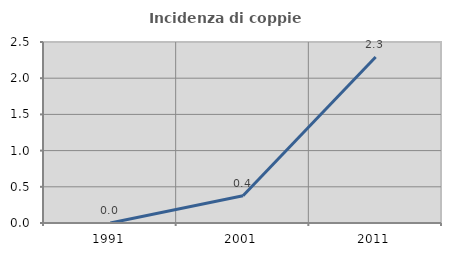
| Category | Incidenza di coppie miste |
|---|---|
| 1991.0 | 0 |
| 2001.0 | 0.376 |
| 2011.0 | 2.294 |